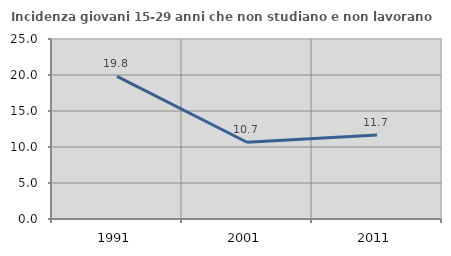
| Category | Incidenza giovani 15-29 anni che non studiano e non lavorano  |
|---|---|
| 1991.0 | 19.799 |
| 2001.0 | 10.663 |
| 2011.0 | 11.673 |